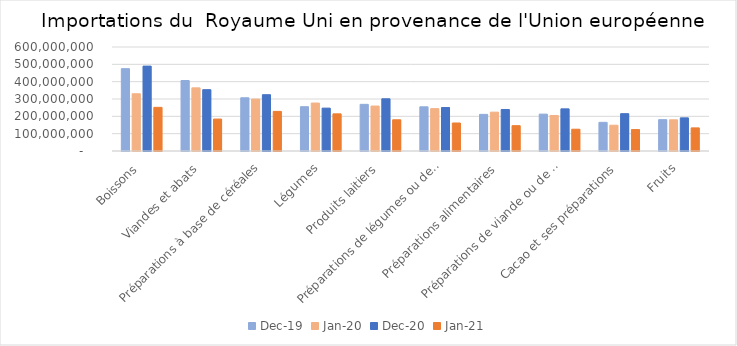
| Category | déc-19 | janv-20 | déc-20 | janv-21 |
|---|---|---|---|---|
| Boissons | 474933662 | 330247111 | 489679965 | 251927131 |
| Viandes et abats | 406575084 | 364306566 | 353746484 | 184255212 |
| Préparations à base de céréales | 307036712 | 299492997 | 324785415 | 228544616 |
| Légumes | 255487084 | 276600913 | 247338185 | 214307815 |
| Produits laitiers | 269155092 | 259284758 | 301210897 | 180048677 |
| Préparations de légumes ou de fruits | 254975052 | 244441070 | 250713621 | 161536907 |
| Préparations alimentaires | 211299641 | 224081932 | 239596829 | 146108980 |
| Préparations de viande ou de poisson | 212659985 | 204827730 | 243207731 | 125630521 |
| Cacao et ses préparations | 165335694 | 148719391 | 215323219 | 123626649 |
| Fruits | 180787261 | 179887129 | 191247188 | 133311677 |